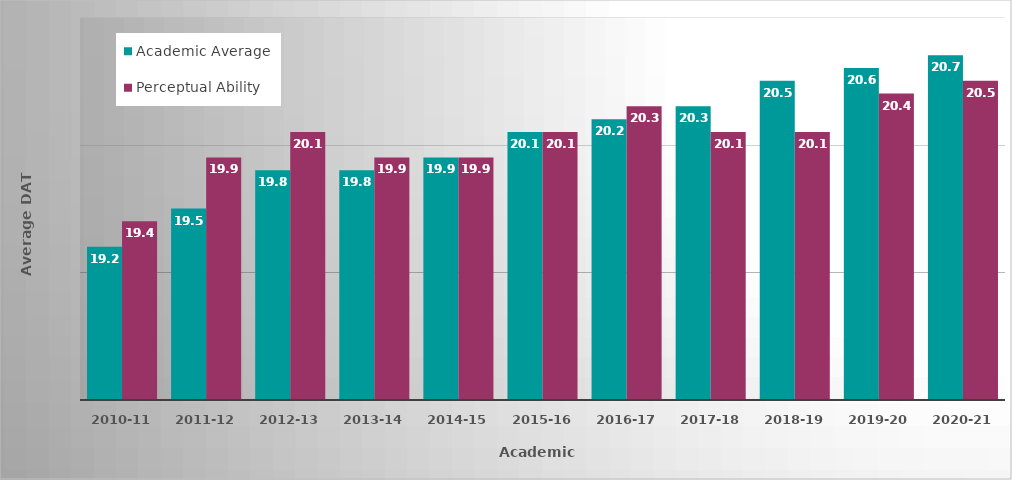
| Category | Academic Average | Perceptual Ability |
|---|---|---|
| 2010-11 | 19.2 | 19.4 |
| 2011-12 | 19.5 | 19.9 |
| 2012-13 | 19.8 | 20.1 |
| 2013-14 | 19.8 | 19.9 |
| 2014-15 | 19.9 | 19.9 |
| 2015-16 | 20.1 | 20.1 |
| 2016-17 | 20.2 | 20.3 |
| 2017-18 | 20.3 | 20.1 |
| 2018-19 | 20.5 | 20.1 |
| 2019-20 | 20.6 | 20.4 |
| 2020-21 | 20.7 | 20.5 |